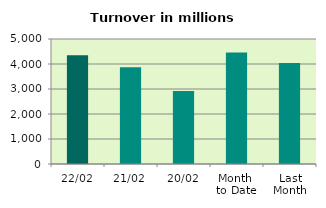
| Category | Series 0 |
|---|---|
| 22/02 | 4352.192 |
| 21/02 | 3870.068 |
| 20/02 | 2915.543 |
| Month 
to Date | 4460.122 |
| Last
Month | 4043.095 |